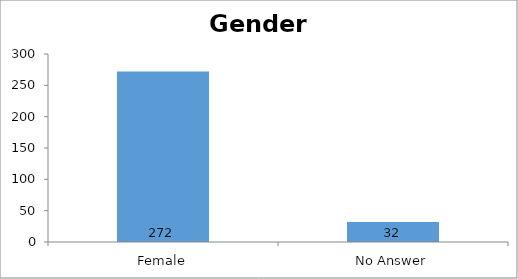
| Category | Gender |
|---|---|
| Female | 272 |
| No Answer | 32 |